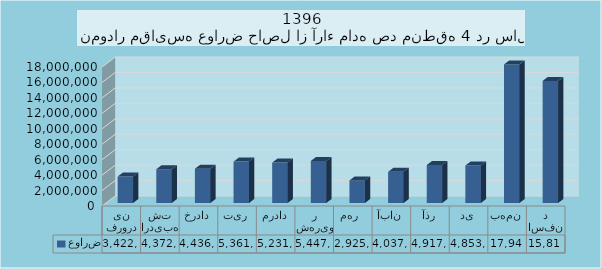
| Category | عوارض |
|---|---|
| فروردین | 3422995 |
| اردیبهشت | 4372941 |
| خرداد | 4436286 |
| تیر | 5361075 |
| مرداد | 5231756 |
| شهریور | 5447203 |
| مهر  | 2925693 |
| آبان | 4037127 |
| آذر | 4917977 |
| دی | 4853613 |
| بهمن | 17944582 |
| اسفند | 15813781 |